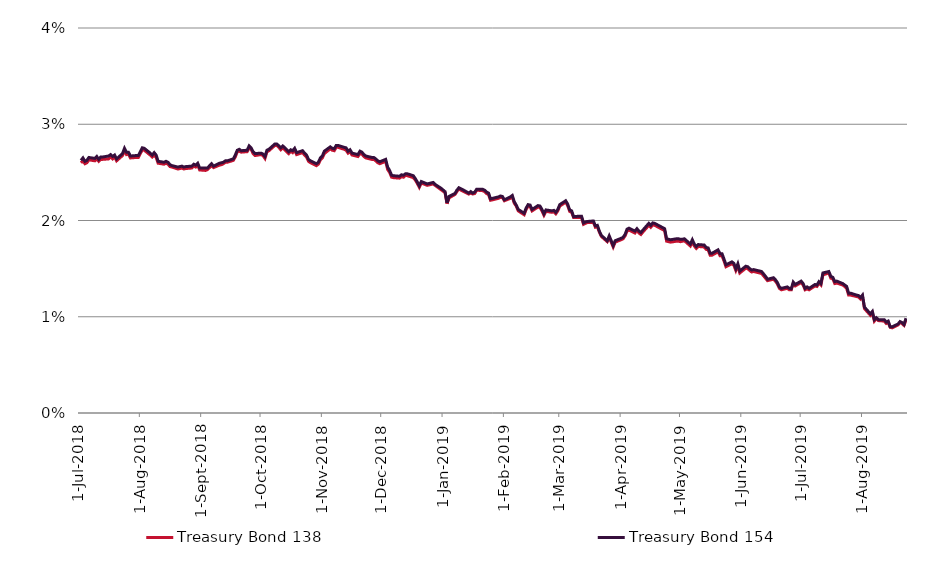
| Category | Treasury Bond 138 | Treasury Bond 154 |
|---|---|---|
| 2018-07-02 | 0.026 | 0.026 |
| 2018-07-03 | 0.026 | 0.026 |
| 2018-07-04 | 0.026 | 0.026 |
| 2018-07-05 | 0.026 | 0.026 |
| 2018-07-06 | 0.026 | 0.027 |
| 2018-07-09 | 0.026 | 0.026 |
| 2018-07-10 | 0.026 | 0.027 |
| 2018-07-11 | 0.026 | 0.026 |
| 2018-07-12 | 0.026 | 0.027 |
| 2018-07-13 | 0.026 | 0.027 |
| 2018-07-16 | 0.026 | 0.027 |
| 2018-07-17 | 0.027 | 0.027 |
| 2018-07-18 | 0.026 | 0.027 |
| 2018-07-19 | 0.027 | 0.027 |
| 2018-07-20 | 0.026 | 0.026 |
| 2018-07-23 | 0.027 | 0.027 |
| 2018-07-24 | 0.027 | 0.028 |
| 2018-07-25 | 0.027 | 0.027 |
| 2018-07-26 | 0.027 | 0.027 |
| 2018-07-27 | 0.026 | 0.027 |
| 2018-07-30 | 0.027 | 0.027 |
| 2018-07-31 | 0.027 | 0.027 |
| 2018-08-01 | 0.027 | 0.027 |
| 2018-08-02 | 0.027 | 0.028 |
| 2018-08-03 | 0.027 | 0.028 |
| 2018-08-06 | 0.027 | 0.027 |
| 2018-08-07 | 0.027 | 0.027 |
| 2018-08-08 | 0.027 | 0.027 |
| 2018-08-09 | 0.027 | 0.027 |
| 2018-08-10 | 0.026 | 0.026 |
| 2018-08-13 | 0.026 | 0.026 |
| 2018-08-14 | 0.026 | 0.026 |
| 2018-08-15 | 0.026 | 0.026 |
| 2018-08-16 | 0.026 | 0.026 |
| 2018-08-17 | 0.026 | 0.026 |
| 2018-08-20 | 0.025 | 0.026 |
| 2018-08-21 | 0.025 | 0.026 |
| 2018-08-22 | 0.025 | 0.026 |
| 2018-08-23 | 0.025 | 0.026 |
| 2018-08-24 | 0.025 | 0.026 |
| 2018-08-27 | 0.025 | 0.026 |
| 2018-08-28 | 0.026 | 0.026 |
| 2018-08-29 | 0.026 | 0.026 |
| 2018-08-30 | 0.026 | 0.026 |
| 2018-08-31 | 0.025 | 0.025 |
| 2018-09-03 | 0.025 | 0.025 |
| 2018-09-04 | 0.025 | 0.025 |
| 2018-09-05 | 0.026 | 0.026 |
| 2018-09-06 | 0.026 | 0.026 |
| 2018-09-07 | 0.026 | 0.026 |
| 2018-09-10 | 0.026 | 0.026 |
| 2018-09-11 | 0.026 | 0.026 |
| 2018-09-12 | 0.026 | 0.026 |
| 2018-09-13 | 0.026 | 0.026 |
| 2018-09-14 | 0.026 | 0.026 |
| 2018-09-17 | 0.026 | 0.026 |
| 2018-09-18 | 0.027 | 0.027 |
| 2018-09-19 | 0.027 | 0.027 |
| 2018-09-20 | 0.027 | 0.027 |
| 2018-09-21 | 0.027 | 0.027 |
| 2018-09-24 | 0.027 | 0.027 |
| 2018-09-25 | 0.028 | 0.028 |
| 2018-09-26 | 0.027 | 0.028 |
| 2018-09-27 | 0.027 | 0.027 |
| 2018-09-28 | 0.027 | 0.027 |
| 2018-10-01 | 0.027 | 0.027 |
| 2018-10-02 | 0.027 | 0.027 |
| 2018-10-03 | 0.026 | 0.027 |
| 2018-10-04 | 0.027 | 0.027 |
| 2018-10-05 | 0.027 | 0.027 |
| 2018-10-08 | 0.028 | 0.028 |
| 2018-10-09 | 0.028 | 0.028 |
| 2018-10-10 | 0.028 | 0.028 |
| 2018-10-11 | 0.027 | 0.028 |
| 2018-10-12 | 0.028 | 0.028 |
| 2018-10-15 | 0.027 | 0.027 |
| 2018-10-16 | 0.027 | 0.027 |
| 2018-10-17 | 0.027 | 0.027 |
| 2018-10-18 | 0.027 | 0.028 |
| 2018-10-19 | 0.027 | 0.027 |
| 2018-10-22 | 0.027 | 0.027 |
| 2018-10-23 | 0.027 | 0.027 |
| 2018-10-24 | 0.027 | 0.027 |
| 2018-10-25 | 0.026 | 0.026 |
| 2018-10-26 | 0.026 | 0.026 |
| 2018-10-29 | 0.026 | 0.026 |
| 2018-10-30 | 0.026 | 0.026 |
| 2018-10-31 | 0.026 | 0.026 |
| 2018-11-01 | 0.026 | 0.027 |
| 2018-11-02 | 0.027 | 0.027 |
| 2018-11-05 | 0.027 | 0.028 |
| 2018-11-06 | 0.027 | 0.028 |
| 2018-11-07 | 0.027 | 0.027 |
| 2018-11-08 | 0.028 | 0.028 |
| 2018-11-09 | 0.028 | 0.028 |
| 2018-11-12 | 0.027 | 0.028 |
| 2018-11-13 | 0.027 | 0.028 |
| 2018-11-14 | 0.027 | 0.027 |
| 2018-11-15 | 0.027 | 0.027 |
| 2018-11-16 | 0.027 | 0.027 |
| 2018-11-19 | 0.027 | 0.027 |
| 2018-11-20 | 0.027 | 0.027 |
| 2018-11-21 | 0.027 | 0.027 |
| 2018-11-22 | 0.027 | 0.027 |
| 2018-11-23 | 0.026 | 0.027 |
| 2018-11-26 | 0.026 | 0.027 |
| 2018-11-27 | 0.026 | 0.027 |
| 2018-11-28 | 0.026 | 0.026 |
| 2018-11-29 | 0.026 | 0.026 |
| 2018-11-30 | 0.026 | 0.026 |
| 2018-12-03 | 0.026 | 0.026 |
| 2018-12-04 | 0.025 | 0.026 |
| 2018-12-05 | 0.025 | 0.025 |
| 2018-12-06 | 0.024 | 0.025 |
| 2018-12-07 | 0.024 | 0.025 |
| 2018-12-10 | 0.024 | 0.025 |
| 2018-12-11 | 0.025 | 0.025 |
| 2018-12-12 | 0.024 | 0.025 |
| 2018-12-13 | 0.025 | 0.025 |
| 2018-12-14 | 0.025 | 0.025 |
| 2018-12-17 | 0.024 | 0.025 |
| 2018-12-18 | 0.024 | 0.024 |
| 2018-12-19 | 0.024 | 0.024 |
| 2018-12-20 | 0.023 | 0.024 |
| 2018-12-21 | 0.024 | 0.024 |
| 2018-12-24 | 0.024 | 0.024 |
| 2018-12-27 | 0.024 | 0.024 |
| 2018-12-28 | 0.024 | 0.024 |
| 2018-12-31 | 0.023 | 0.023 |
| 2019-01-02 | 0.023 | 0.023 |
| 2019-01-03 | 0.022 | 0.022 |
| 2019-01-04 | 0.022 | 0.022 |
| 2019-01-07 | 0.023 | 0.023 |
| 2019-01-08 | 0.023 | 0.023 |
| 2019-01-09 | 0.023 | 0.023 |
| 2019-01-10 | 0.023 | 0.023 |
| 2019-01-11 | 0.023 | 0.023 |
| 2019-01-14 | 0.023 | 0.023 |
| 2019-01-15 | 0.023 | 0.023 |
| 2019-01-16 | 0.023 | 0.023 |
| 2019-01-17 | 0.023 | 0.023 |
| 2019-01-18 | 0.023 | 0.023 |
| 2019-01-21 | 0.023 | 0.023 |
| 2019-01-22 | 0.023 | 0.023 |
| 2019-01-23 | 0.023 | 0.023 |
| 2019-01-24 | 0.023 | 0.023 |
| 2019-01-25 | 0.022 | 0.022 |
| 2019-01-29 | 0.022 | 0.022 |
| 2019-01-30 | 0.022 | 0.023 |
| 2019-01-31 | 0.022 | 0.022 |
| 2019-02-01 | 0.022 | 0.022 |
| 2019-02-04 | 0.022 | 0.022 |
| 2019-02-05 | 0.022 | 0.023 |
| 2019-02-06 | 0.022 | 0.022 |
| 2019-02-07 | 0.022 | 0.022 |
| 2019-02-08 | 0.021 | 0.021 |
| 2019-02-11 | 0.021 | 0.021 |
| 2019-02-12 | 0.021 | 0.021 |
| 2019-02-13 | 0.022 | 0.022 |
| 2019-02-14 | 0.021 | 0.022 |
| 2019-02-15 | 0.021 | 0.021 |
| 2019-02-18 | 0.021 | 0.022 |
| 2019-02-19 | 0.021 | 0.022 |
| 2019-02-20 | 0.021 | 0.021 |
| 2019-02-21 | 0.021 | 0.021 |
| 2019-02-22 | 0.021 | 0.021 |
| 2019-02-25 | 0.021 | 0.021 |
| 2019-02-26 | 0.021 | 0.021 |
| 2019-02-27 | 0.021 | 0.021 |
| 2019-02-28 | 0.021 | 0.021 |
| 2019-03-01 | 0.022 | 0.022 |
| 2019-03-04 | 0.022 | 0.022 |
| 2019-03-05 | 0.022 | 0.022 |
| 2019-03-06 | 0.021 | 0.021 |
| 2019-03-07 | 0.021 | 0.021 |
| 2019-03-08 | 0.02 | 0.02 |
| 2019-03-11 | 0.02 | 0.02 |
| 2019-03-12 | 0.02 | 0.02 |
| 2019-03-13 | 0.02 | 0.02 |
| 2019-03-14 | 0.02 | 0.02 |
| 2019-03-15 | 0.02 | 0.02 |
| 2019-03-18 | 0.02 | 0.02 |
| 2019-03-19 | 0.019 | 0.019 |
| 2019-03-20 | 0.019 | 0.02 |
| 2019-03-21 | 0.019 | 0.019 |
| 2019-03-22 | 0.018 | 0.018 |
| 2019-03-25 | 0.018 | 0.018 |
| 2019-03-26 | 0.018 | 0.018 |
| 2019-03-27 | 0.018 | 0.018 |
| 2019-03-28 | 0.017 | 0.017 |
| 2019-03-29 | 0.018 | 0.018 |
| 2019-04-01 | 0.018 | 0.018 |
| 2019-04-02 | 0.018 | 0.018 |
| 2019-04-03 | 0.018 | 0.019 |
| 2019-04-04 | 0.019 | 0.019 |
| 2019-04-05 | 0.019 | 0.019 |
| 2019-04-08 | 0.019 | 0.019 |
| 2019-04-09 | 0.019 | 0.019 |
| 2019-04-10 | 0.019 | 0.019 |
| 2019-04-11 | 0.019 | 0.019 |
| 2019-04-12 | 0.019 | 0.019 |
| 2019-04-15 | 0.02 | 0.02 |
| 2019-04-16 | 0.019 | 0.02 |
| 2019-04-17 | 0.02 | 0.02 |
| 2019-04-18 | 0.02 | 0.02 |
| 2019-04-23 | 0.019 | 0.019 |
| 2019-04-24 | 0.018 | 0.018 |
| 2019-04-26 | 0.018 | 0.018 |
| 2019-04-29 | 0.018 | 0.018 |
| 2019-04-30 | 0.018 | 0.018 |
| 2019-05-01 | 0.018 | 0.018 |
| 2019-05-02 | 0.018 | 0.018 |
| 2019-05-03 | 0.018 | 0.018 |
| 2019-05-06 | 0.017 | 0.018 |
| 2019-05-07 | 0.018 | 0.018 |
| 2019-05-08 | 0.017 | 0.018 |
| 2019-05-09 | 0.017 | 0.017 |
| 2019-05-10 | 0.017 | 0.018 |
| 2019-05-13 | 0.017 | 0.017 |
| 2019-05-14 | 0.017 | 0.017 |
| 2019-05-15 | 0.017 | 0.017 |
| 2019-05-16 | 0.016 | 0.017 |
| 2019-05-17 | 0.016 | 0.017 |
| 2019-05-20 | 0.017 | 0.017 |
| 2019-05-21 | 0.016 | 0.017 |
| 2019-05-22 | 0.016 | 0.017 |
| 2019-05-23 | 0.016 | 0.016 |
| 2019-05-24 | 0.015 | 0.015 |
| 2019-05-27 | 0.016 | 0.016 |
| 2019-05-28 | 0.015 | 0.016 |
| 2019-05-29 | 0.015 | 0.015 |
| 2019-05-30 | 0.015 | 0.016 |
| 2019-05-31 | 0.015 | 0.015 |
| 2019-06-03 | 0.015 | 0.015 |
| 2019-06-04 | 0.015 | 0.015 |
| 2019-06-05 | 0.015 | 0.015 |
| 2019-06-06 | 0.015 | 0.015 |
| 2019-06-07 | 0.015 | 0.015 |
| 2019-06-11 | 0.014 | 0.015 |
| 2019-06-12 | 0.014 | 0.014 |
| 2019-06-13 | 0.014 | 0.014 |
| 2019-06-14 | 0.014 | 0.014 |
| 2019-06-17 | 0.014 | 0.014 |
| 2019-06-18 | 0.014 | 0.014 |
| 2019-06-19 | 0.013 | 0.014 |
| 2019-06-20 | 0.013 | 0.013 |
| 2019-06-21 | 0.013 | 0.013 |
| 2019-06-24 | 0.013 | 0.013 |
| 2019-06-25 | 0.013 | 0.013 |
| 2019-06-26 | 0.013 | 0.013 |
| 2019-06-27 | 0.013 | 0.014 |
| 2019-06-28 | 0.013 | 0.013 |
| 2019-07-01 | 0.014 | 0.014 |
| 2019-07-02 | 0.013 | 0.013 |
| 2019-07-03 | 0.013 | 0.013 |
| 2019-07-04 | 0.013 | 0.013 |
| 2019-07-05 | 0.013 | 0.013 |
| 2019-07-08 | 0.013 | 0.013 |
| 2019-07-09 | 0.013 | 0.013 |
| 2019-07-10 | 0.014 | 0.014 |
| 2019-07-11 | 0.013 | 0.013 |
| 2019-07-12 | 0.014 | 0.015 |
| 2019-07-15 | 0.015 | 0.015 |
| 2019-07-16 | 0.014 | 0.014 |
| 2019-07-17 | 0.014 | 0.014 |
| 2019-07-18 | 0.013 | 0.014 |
| 2019-07-19 | 0.014 | 0.014 |
| 2019-07-22 | 0.013 | 0.013 |
| 2019-07-23 | 0.013 | 0.013 |
| 2019-07-24 | 0.013 | 0.013 |
| 2019-07-25 | 0.012 | 0.012 |
| 2019-07-26 | 0.012 | 0.012 |
| 2019-07-29 | 0.012 | 0.012 |
| 2019-07-30 | 0.012 | 0.012 |
| 2019-07-31 | 0.012 | 0.012 |
| 2019-08-01 | 0.012 | 0.012 |
| 2019-08-02 | 0.011 | 0.011 |
| 2019-08-05 | 0.01 | 0.01 |
| 2019-08-06 | 0.01 | 0.011 |
| 2019-08-07 | 0.01 | 0.01 |
| 2019-08-08 | 0.01 | 0.01 |
| 2019-08-09 | 0.01 | 0.01 |
| 2019-08-12 | 0.01 | 0.01 |
| 2019-08-13 | 0.009 | 0.009 |
| 2019-08-14 | 0.009 | 0.01 |
| 2019-08-15 | 0.009 | 0.009 |
| 2019-08-16 | 0.009 | 0.009 |
| 2019-08-19 | 0.009 | 0.009 |
| 2019-08-20 | 0.009 | 0.01 |
| 2019-08-21 | 0.009 | 0.009 |
| 2019-08-22 | 0.009 | 0.009 |
| 2019-08-23 | 0.01 | 0.01 |